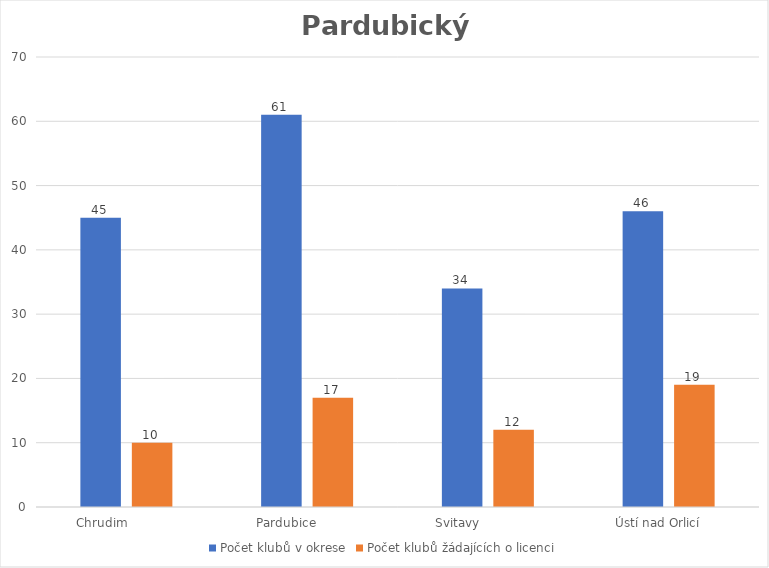
| Category | Počet klubů v okrese | Počet klubů žádajících o licenci |
|---|---|---|
| Chrudim             | 45 | 10 |
| Pardubice           | 61 | 17 |
| Svitavy                | 34 | 12 |
| Ústí nad Orlicí      | 46 | 19 |